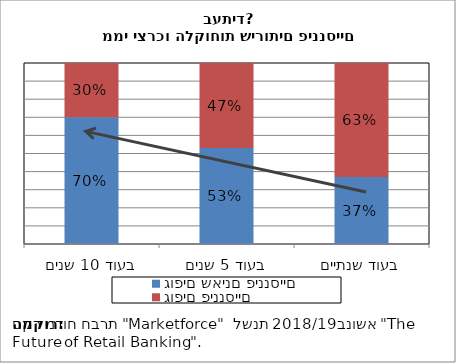
| Category | גופים שאינם פיננסיים | גופים פיננסיים |
|---|---|---|
| בעוד שנתיים | 0.37 | 0.63 |
| בעוד 5 שנים | 0.53 | 0.47 |
| בעוד 10 שנים | 0.7 | 0.3 |